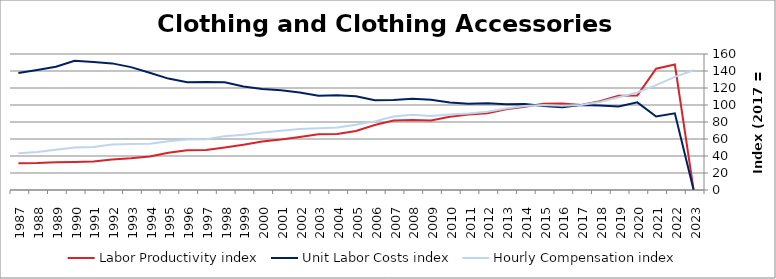
| Category | Labor Productivity index | Unit Labor Costs index | Hourly Compensation index |
|---|---|---|---|
| 2023.0 | 0 | 0 | 140.816 |
| 2022.0 | 147.592 | 90.14 | 133.04 |
| 2021.0 | 142.694 | 86.41 | 123.302 |
| 2020.0 | 111.298 | 103.121 | 114.772 |
| 2019.0 | 110.901 | 98.368 | 109.092 |
| 2018.0 | 104.315 | 99.365 | 103.652 |
| 2017.0 | 100 | 100 | 100 |
| 2016.0 | 101.866 | 97.423 | 99.241 |
| 2015.0 | 101.373 | 98.698 | 100.053 |
| 2014.0 | 97.892 | 101.072 | 98.941 |
| 2013.0 | 95.005 | 100.874 | 95.835 |
| 2012.0 | 90.392 | 101.983 | 92.184 |
| 2011.0 | 88.678 | 101.557 | 90.059 |
| 2010.0 | 86.266 | 102.896 | 88.764 |
| 2009.0 | 81.845 | 106.26 | 86.969 |
| 2008.0 | 82.485 | 107.265 | 88.478 |
| 2007.0 | 81.676 | 105.988 | 86.567 |
| 2006.0 | 76.404 | 105.693 | 80.753 |
| 2005.0 | 69.511 | 110.312 | 76.679 |
| 2004.0 | 65.93 | 111.411 | 73.454 |
| 2003.0 | 65.638 | 110.782 | 72.715 |
| 2002.0 | 62.429 | 114.82 | 71.681 |
| 2001.0 | 59.365 | 117.401 | 69.695 |
| 2000.0 | 57.006 | 118.761 | 67.701 |
| 1999.0 | 53.322 | 121.811 | 64.952 |
| 1998.0 | 50.03 | 126.664 | 63.37 |
| 1997.0 | 47.077 | 127.041 | 59.807 |
| 1996.0 | 46.826 | 126.906 | 59.425 |
| 1995.0 | 43.732 | 131.08 | 57.324 |
| 1994.0 | 39.462 | 137.897 | 54.417 |
| 1993.0 | 37.372 | 144.58 | 54.032 |
| 1992.0 | 35.866 | 148.966 | 53.428 |
| 1991.0 | 33.565 | 150.613 | 50.553 |
| 1990.0 | 32.957 | 151.943 | 50.075 |
| 1989.0 | 32.693 | 144.977 | 47.397 |
| 1988.0 | 31.748 | 141.108 | 44.799 |
| 1987.0 | 31.369 | 137.563 | 43.152 |